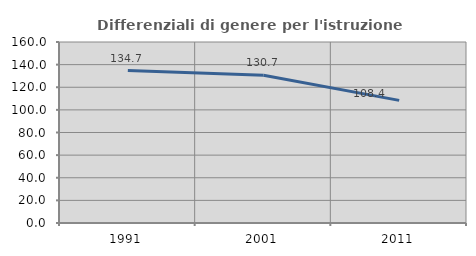
| Category | Differenziali di genere per l'istruzione superiore |
|---|---|
| 1991.0 | 134.74 |
| 2001.0 | 130.659 |
| 2011.0 | 108.419 |